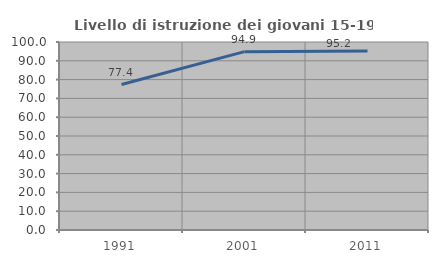
| Category | Livello di istruzione dei giovani 15-19 anni |
|---|---|
| 1991.0 | 77.358 |
| 2001.0 | 94.872 |
| 2011.0 | 95.238 |